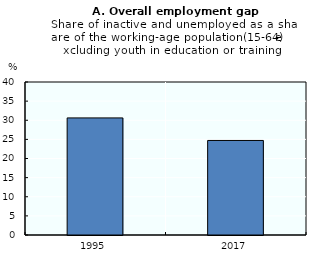
| Category | Series 0 |
|---|---|
| 1995.0 | 30.61 |
| 2017.0 | 24.715 |